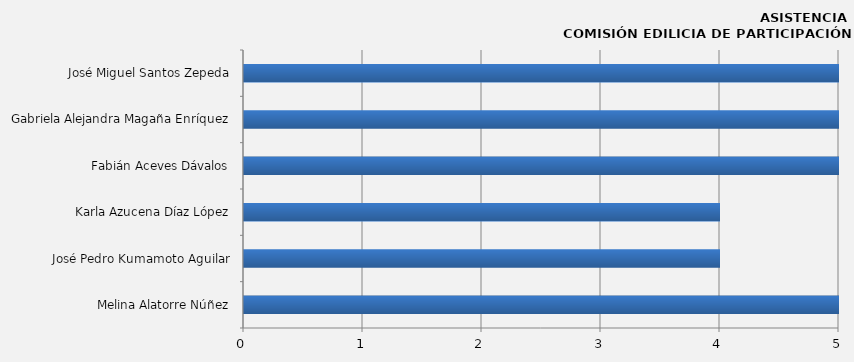
| Category | Series 0 |
|---|---|
| Melina Alatorre Núñez | 5 |
| José Pedro Kumamoto Aguilar | 4 |
| Karla Azucena Díaz López | 4 |
| Fabián Aceves Dávalos | 5 |
| Gabriela Alejandra Magaña Enríquez | 5 |
| José Miguel Santos Zepeda | 5 |